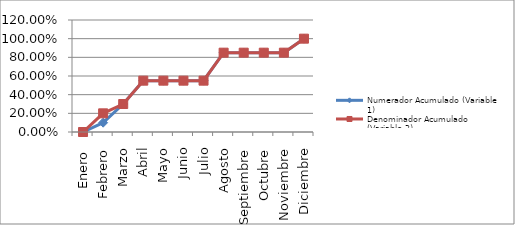
| Category | Numerador Acumulado (Variable 1) | Denominador Acumulado (Variable 2) |
|---|---|---|
| Enero  | 0 | 0 |
| Febrero | 0.1 | 0.2 |
| Marzo | 0.3 | 0.3 |
| Abril | 0.55 | 0.55 |
| Mayo | 0.55 | 0.55 |
| Junio | 0.55 | 0.55 |
| Julio | 0.55 | 0.55 |
| Agosto | 0.85 | 0.85 |
| Septiembre | 0.85 | 0.85 |
| Octubre | 0.85 | 0.85 |
| Noviembre | 0.85 | 0.85 |
| Diciembre | 1 | 1 |